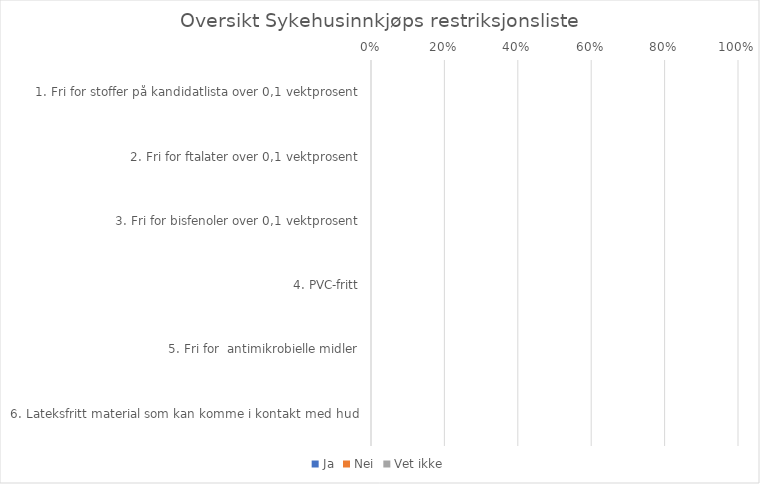
| Category | Ja | Nei | Vet ikke |
|---|---|---|---|
| 1. Fri for stoffer på kandidatlista over 0,1 vektprosent | 0 | 0 | 0 |
| 2. Fri for ftalater over 0,1 vektprosent | 0 | 0 | 0 |
| 3. Fri for bisfenoler over 0,1 vektprosent | 0 | 0 | 0 |
| 4. PVC-fritt | 0 | 0 | 0 |
| 5. Fri for  antimikrobielle midler | 0 | 0 | 0 |
| 6. Lateksfritt material som kan komme i kontakt med hud | 0 | 0 | 0 |